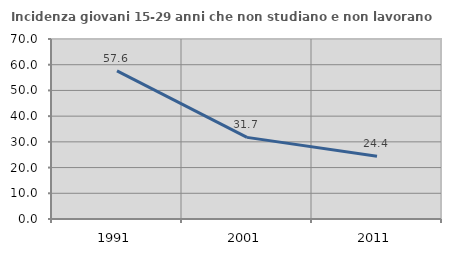
| Category | Incidenza giovani 15-29 anni che non studiano e non lavorano  |
|---|---|
| 1991.0 | 57.615 |
| 2001.0 | 31.742 |
| 2011.0 | 24.374 |